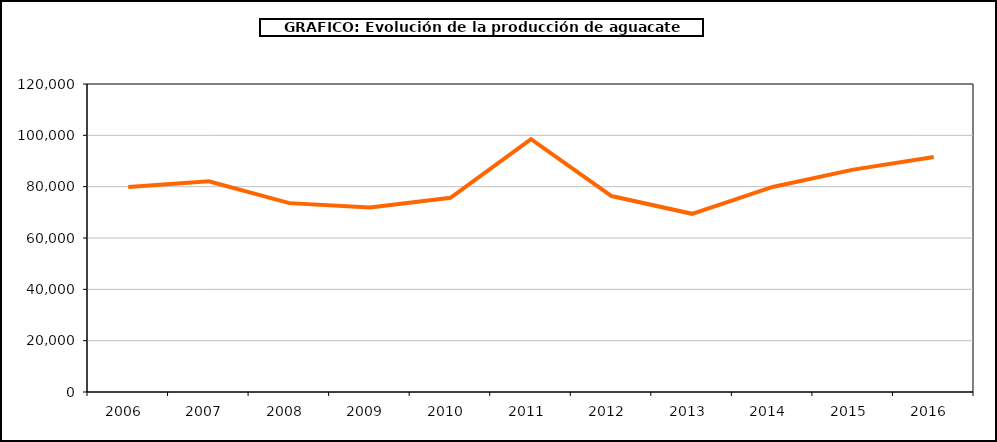
| Category | producción aguacate |
|---|---|
| 2006.0 | 79824 |
| 2007.0 | 82116 |
| 2008.0 | 73585 |
| 2009.0 | 71931 |
| 2010.0 | 75655 |
| 2011.0 | 98535 |
| 2012.0 | 76337 |
| 2013.0 | 69427 |
| 2014.0 | 79886 |
| 2015.0 | 86636 |
| 2016.0 | 91530 |